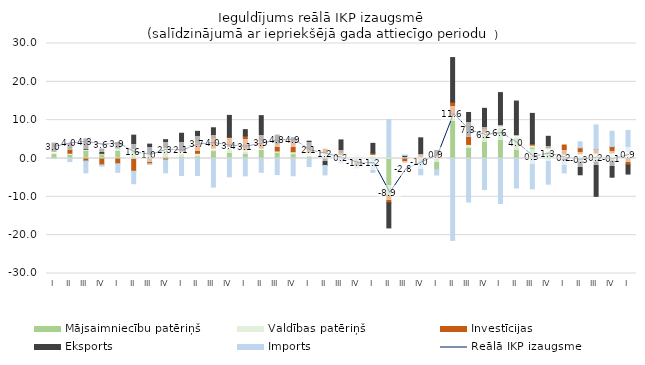
| Category | Mājsaimniecību patēriņš | Valdības patēriņš | Investīcijas | Eksports | Imports |
|---|---|---|---|---|---|
| I | 1.471 | 0.435 | 0.021 | 2.085 | -0.015 |
| II | 1.039 | 0.337 | 1.113 | 1.391 | -0.814 |
| III | 2.119 | 0.287 | -0.668 | 2.703 | -3.069 |
| IV | 1.174 | 0.162 | -1.667 | 1.146 | -0.326 |
| I | 2.517 | 0.208 | -1.375 | 1.444 | -2.234 |
| II | 2.29 | 0.235 | -3.321 | 3.567 | -3.269 |
| III | 1.008 | 0.329 | -1.383 | 2.41 | -0.187 |
| IV | 2.282 | 0.532 | -0.392 | 2.102 | -3.346 |
| I | 1.274 | 0.59 | 0.265 | 4.453 | -4.42 |
| II | 0.66 | 0.699 | 2.928 | 2.793 | -4.446 |
| III | 2.049 | 0.676 | 2.66 | 2.63 | -7.459 |
| IV | 2.582 | 0.547 | 2.487 | 5.63 | -4.77 |
| I | 1.86 | 0.414 | 3.626 | 1.63 | -4.52 |
| II | 2.365 | 0.32 | 2.07 | 6.429 | -3.614 |
| III | 1.604 | 0.353 | 2.056 | 2.092 | -4.195 |
| IV | 1.243 | 0.516 | 2.69 | 0.982 | -4.505 |
| I | 0.791 | 0.795 | 0.886 | 2.048 | -2.113 |
| II | 0.591 | 0.939 | 0.912 | -1.833 | -2.444 |
| III | 0.05 | 0.955 | 0.657 | 3.187 | -1.249 |
| IV | -1.163 | 0.829 | -0.626 | -0.101 | -0.578 |
| I | 0.482 | 0.599 | 0.344 | 2.53 | -3.598 |
| II | -9.615 | 0.379 | -1.955 | -6.54 | 9.788 |
| III | 0.094 | 0.31 | -0.951 | 0.395 | 0.073 |
| IV | -0.89 | 0.434 | 0.592 | 4.369 | -3.35 |
| I | -2.898 | 0.554 | 0.392 | 1.157 | -1.408 |
| II | 10.516 | 0.77 | 3.443 | 11.604 | -21.36 |
| III | 2.909 | 0.76 | 2.168 | 6.172 | -11.344 |
| IV | 6.329 | 0.522 | 0.833 | 5.406 | -8.104 |
| I | 8.072 | 0.422 | 0.12 | 8.579 | -11.727 |
| II | 5.57 | 0.454 | 0.073 | 8.89 | -7.693 |
| III | 2.942 | 0.538 | 0.373 | 7.916 | -7.924 |
| IV | 1.864 | 0.863 | 0.127 | 2.936 | -6.702 |
| I | -0.118 | 1.122 | 2.397 | -0.472 | -3.192 |
| II | -0.923 | 1.272 | 1.531 | -3.326 | 1.558 |
| III | -0.968 | 1.431 | 0.963 | -8.906 | 6.36 |
| IV | -0.712 | 1.471 | 1.662 | -4.168 | 3.97 |
| I | 0.329 | 1.503 | -1.718 | -2.346 | 5.492 |